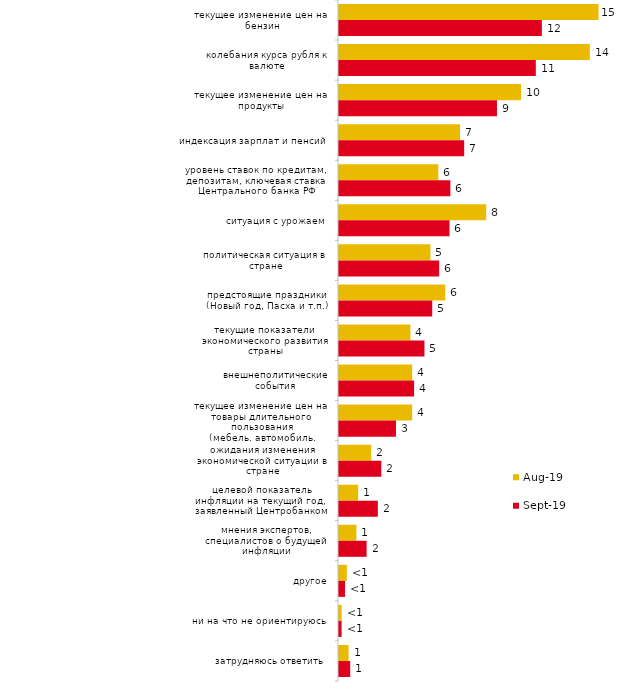
| Category | авг.19 | сен.19 |
|---|---|---|
| текущее изменение цен на бензин | 14.885 | 11.634 |
| колебания курса рубля к валюте | 14.386 | 11.287 |
| текущее изменение цен на продукты | 10.44 | 9.059 |
| индексация зарплат и пенсий | 6.943 | 7.178 |
| уровень ставок по кредитам, депозитам, ключевая ставка Центрального банка РФ | 5.694 | 6.386 |
| ситуация с урожаем | 8.442 | 6.337 |
| политическая ситуация в стране | 5.245 | 5.743 |
| предстоящие праздники (Новый год, Пасха и т.п.) | 6.094 | 5.347 |
| текущие показатели экономического развития страны | 4.096 | 4.901 |
| внешнеполитические события | 4.196 | 4.307 |
| текущее изменение цен на товары длительного пользования (мебель, автомобиль, бытовая техника и т.п.) | 4.196 | 3.267 |
| ожидания изменения экономической ситуации в стране | 1.848 | 2.426 |
| целевой показатель инфляции на текущий год, заявленный Центробанком | 1.099 | 2.228 |
| мнения экспертов, специалистов о будущей инфляции | 0.999 | 1.584 |
| другое | 0.45 | 0.347 |
| ни на что не ориентируюсь | 0.15 | 0.149 |
| затрудняюсь ответить | 0.549 | 0.644 |